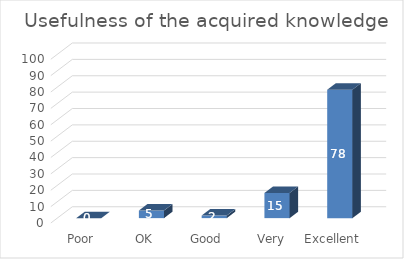
| Category | Usefulness of the acquired knowledge (%) |
|---|---|
| Poor | 0 |
| OK | 4.61 |
| Good | 1.53 |
| Very Good | 15.38 |
| Excellent | 78.46 |